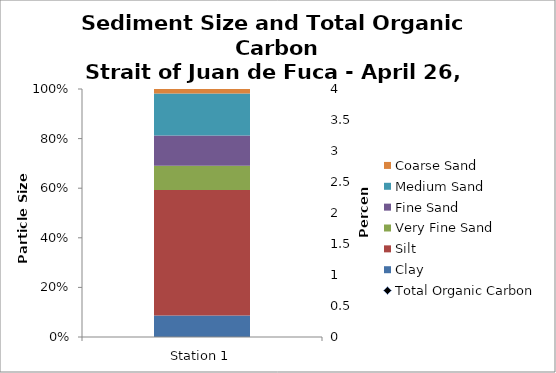
| Category | Clay | Silt | Very Fine Sand | Fine Sand | Medium Sand | Coarse Sand |
|---|---|---|---|---|---|---|
| Station 1 | 8.645 | 50.66 | 9.71 | 12.2 | 17 | 1.795 |